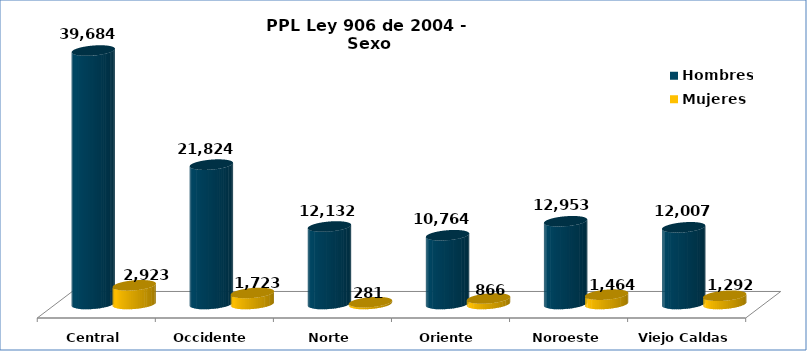
| Category | Hombres | Mujeres |
|---|---|---|
| Central | 39684 | 2923 |
| Occidente | 21824 | 1723 |
| Norte | 12132 | 281 |
| Oriente | 10764 | 866 |
| Noroeste | 12953 | 1464 |
| Viejo Caldas | 12007 | 1292 |